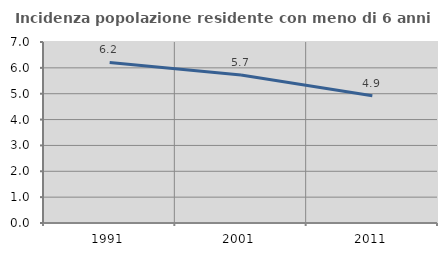
| Category | Incidenza popolazione residente con meno di 6 anni |
|---|---|
| 1991.0 | 6.211 |
| 2001.0 | 5.722 |
| 2011.0 | 4.925 |